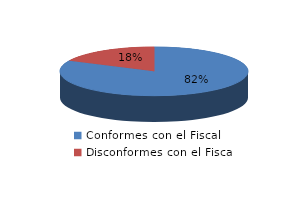
| Category | Series 0 |
|---|---|
| 0 | 74 |
| 1 | 16 |